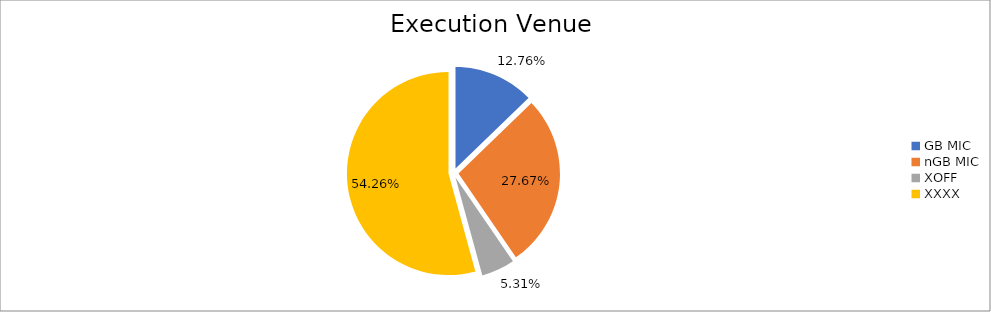
| Category | Series 0 |
|---|---|
| GB MIC | 1103271.803 |
| nGB MIC | 2391255.43 |
| XOFF | 458571.337 |
| XXXX | 4690097.977 |